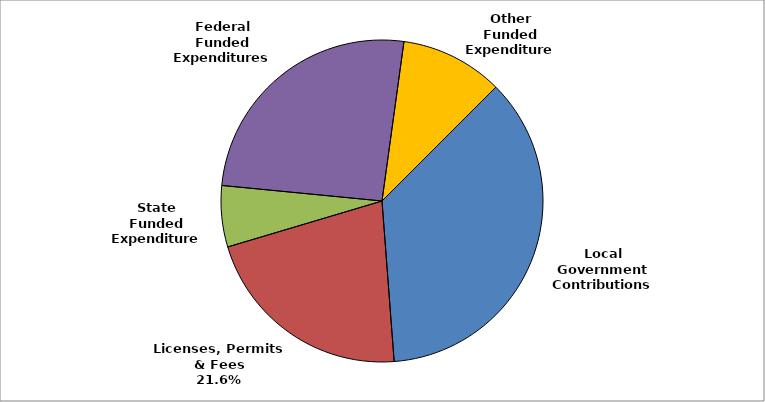
| Category | Series 0 |
|---|---|
| Local Government Contributions | 0.363 |
| Licenses, Permits & Fees | 0.216 |
| State Funded Expenditures | 0.061 |
| Federal Funded Expenditures | 0.256 |
| Other Funded Expenditures | 0.103 |